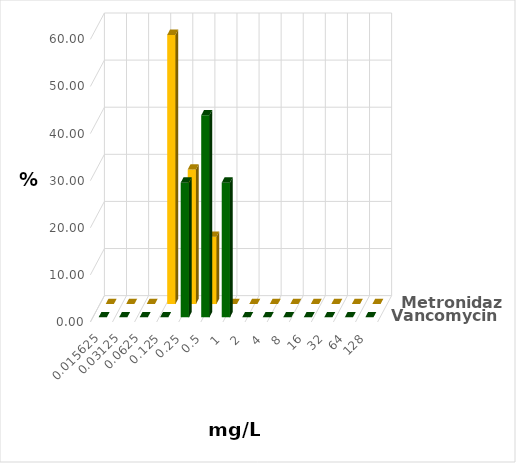
| Category | Vancomycin | Metronidazol |
|---|---|---|
| 0.015625 | 0 | 0 |
| 0.03125 | 0 | 0 |
| 0.0625 | 0 | 0 |
| 0.125 | 0 | 57.143 |
| 0.25 | 28.571 | 28.571 |
| 0.5 | 42.857 | 14.286 |
| 1.0 | 28.571 | 0 |
| 2.0 | 0 | 0 |
| 4.0 | 0 | 0 |
| 8.0 | 0 | 0 |
| 16.0 | 0 | 0 |
| 32.0 | 0 | 0 |
| 64.0 | 0 | 0 |
| 128.0 | 0 | 0 |